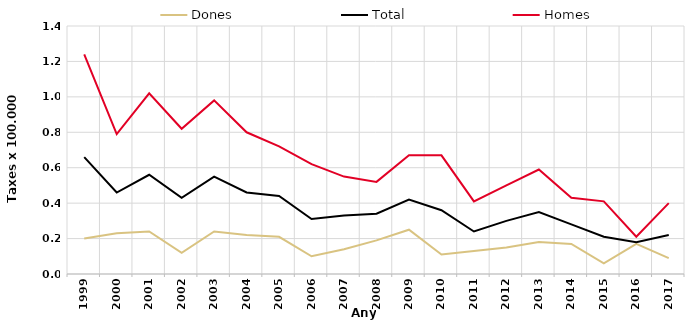
| Category | Dones | Total | Homes |
|---|---|---|---|
| 1999.0 | 0.2 | 0.66 | 1.24 |
| 2000.0 | 0.23 | 0.46 | 0.79 |
| 2001.0 | 0.24 | 0.56 | 1.02 |
| 2002.0 | 0.12 | 0.43 | 0.82 |
| 2003.0 | 0.24 | 0.55 | 0.98 |
| 2004.0 | 0.22 | 0.46 | 0.8 |
| 2005.0 | 0.21 | 0.44 | 0.72 |
| 2006.0 | 0.1 | 0.31 | 0.62 |
| 2007.0 | 0.14 | 0.33 | 0.55 |
| 2008.0 | 0.19 | 0.34 | 0.52 |
| 2009.0 | 0.25 | 0.42 | 0.67 |
| 2010.0 | 0.11 | 0.36 | 0.67 |
| 2011.0 | 0.13 | 0.24 | 0.41 |
| 2012.0 | 0.15 | 0.3 | 0.5 |
| 2013.0 | 0.18 | 0.35 | 0.59 |
| 2014.0 | 0.17 | 0.28 | 0.43 |
| 2015.0 | 0.06 | 0.21 | 0.41 |
| 2016.0 | 0.17 | 0.18 | 0.21 |
| 2017.0 | 0.09 | 0.22 | 0.4 |